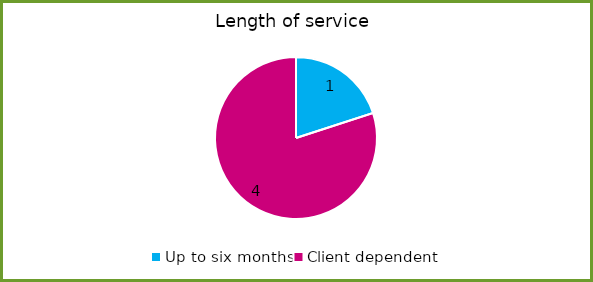
| Category | Series 0 |
|---|---|
| Up to six months | 1 |
| Client dependent | 4 |